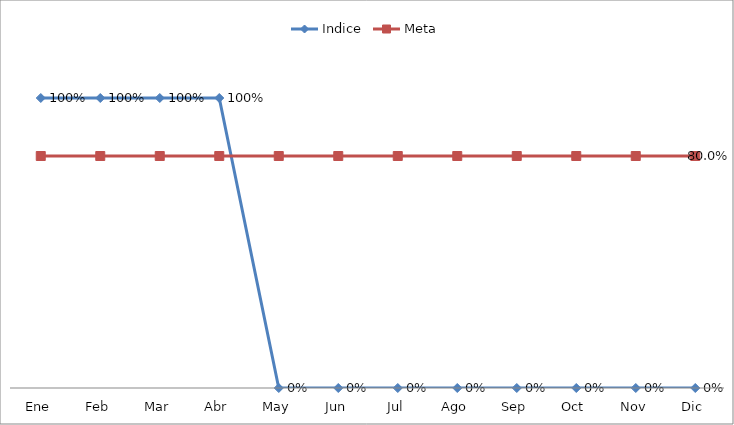
| Category | Indice | Meta |
|---|---|---|
| Ene | 1 | 0.8 |
| Feb | 1 | 0.8 |
| Mar | 1 | 0.8 |
| Abr | 1 | 0.8 |
| May | 0 | 0.8 |
| Jun | 0 | 0.8 |
| Jul | 0 | 0.8 |
| Ago | 0 | 0.8 |
| Sep | 0 | 0.8 |
| Oct | 0 | 0.8 |
| Nov | 0 | 0.8 |
| Dic | 0 | 0.8 |